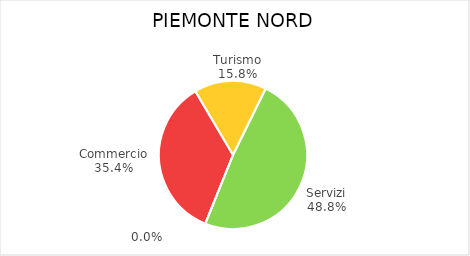
| Category | Piemonte Nord |
|---|---|
| Commercio | 22351 |
| Turismo | 9954 |
| Servizi | 30827 |